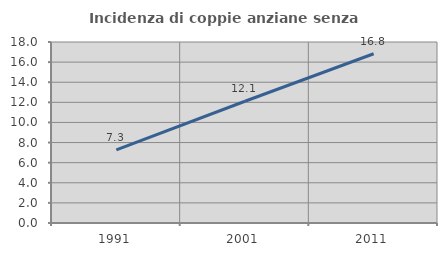
| Category | Incidenza di coppie anziane senza figli  |
|---|---|
| 1991.0 | 7.273 |
| 2001.0 | 12.11 |
| 2011.0 | 16.831 |